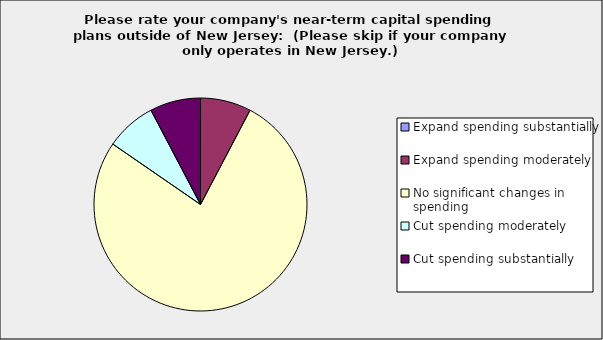
| Category | Series 0 |
|---|---|
| Expand spending substantially | 0 |
| Expand spending moderately | 0.077 |
| No significant changes in spending | 0.769 |
| Cut spending moderately | 0.077 |
| Cut spending substantially | 0.077 |